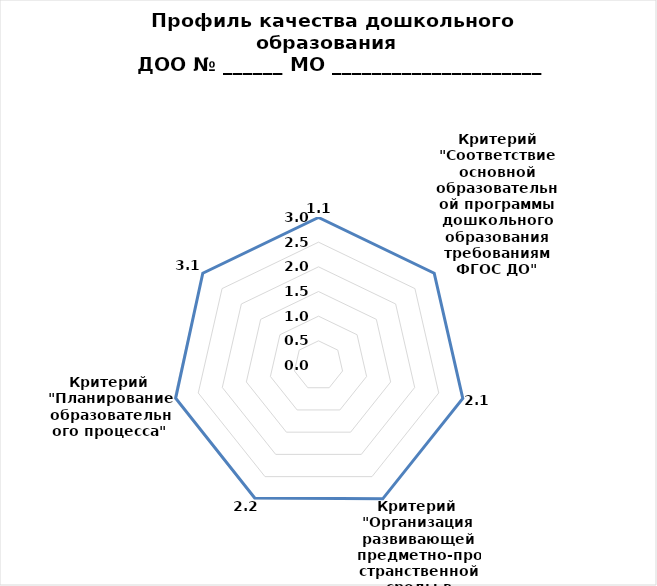
| Category | Series 0 |
|---|---|
| 0 | 3 |
| 1 | 3 |
| 2 | 3 |
| 3 | 3 |
| 4 | 2.981 |
| 5 | 2.97 |
| 6 | 3 |